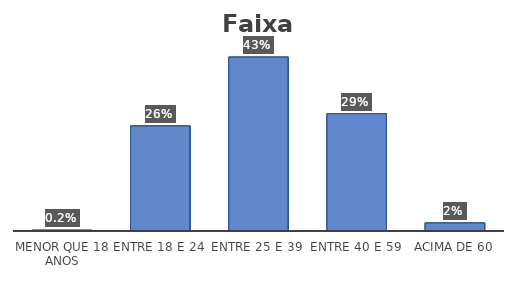
| Category | Series 0 |
|---|---|
| Menor que 18 anos | 0.002 |
| Entre 18 e 24 | 0.26 |
| Entre 25 e 39 | 0.43 |
| Entre 40 e 59 | 0.29 |
| Acima de 60 | 0.02 |